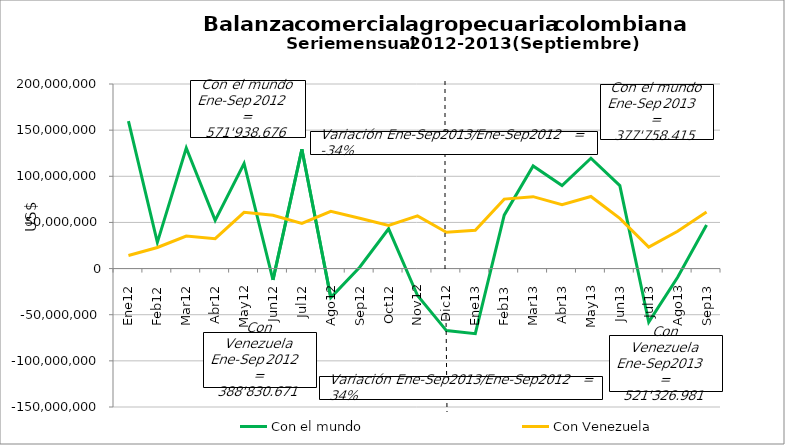
| Category | Con el mundo | Con Venezuela |
|---|---|---|
| 0 | 159718811.51 | 14197513.95 |
| 1 | 28364992.2 | 22842835.63 |
| 2 | 130703935.59 | 35167559.2 |
| 3 | 52247887.52 | 32339443.84 |
| 4 | 113869665.14 | 60940138.48 |
| 5 | -12237508.2 | 57742073.79 |
| 6 | 129307489.88 | 48976990.69 |
| 7 | -31469488.76 | 62120442.79 |
| 8 | 1432890.8 | 54503672.46 |
| 9 | 43089965.32 | 46656108.58 |
| 10 | -29233849.86 | 57069741.79 |
| 11 | -67196809.33 | 39336386.58 |
| 12 | -70591672.64 | 41480993.87 |
| 13 | 57888002.76 | 75265583.15 |
| 14 | 111239208.87 | 77903591.83 |
| 15 | 90043885.64 | 69186752.49 |
| 16 | 119554876.57 | 78087450.67 |
| 17 | 89894947.57 | 54344578.75 |
| 18 | -58064700.6 | 23202042.99 |
| 19 | -9356684.56 | 40439114.69 |
| 20 | 47150551.01 | 61416872.87 |